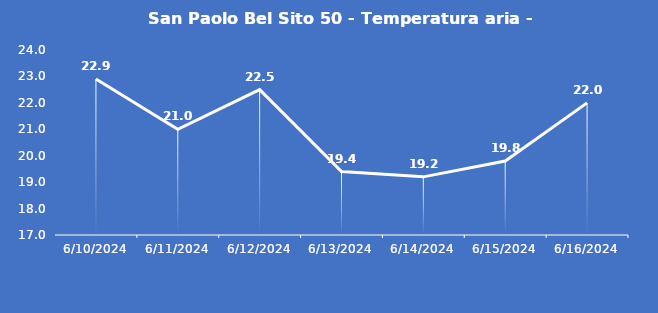
| Category | San Paolo Bel Sito 50 - Temperatura aria - Grezzo (°C) |
|---|---|
| 6/10/24 | 22.9 |
| 6/11/24 | 21 |
| 6/12/24 | 22.5 |
| 6/13/24 | 19.4 |
| 6/14/24 | 19.2 |
| 6/15/24 | 19.8 |
| 6/16/24 | 22 |